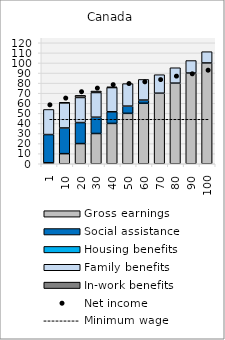
| Category | Gross earnings | Social assistance | Housing benefits | Family benefits | In-work benefits |
|---|---|---|---|---|---|
| 1.0 | 1.001 | 27.956 | 0 | 24.924 | 0 |
| 10.0 | 10 | 25.509 | 0 | 24.924 | 0.425 |
| 20.0 | 20 | 20.85 | 0 | 24.898 | 2.125 |
| 30.0 | 30 | 16.193 | 0 | 24.469 | 1.476 |
| 40.0 | 40 | 11.541 | 0 | 24.042 | 0.673 |
| 50.0 | 50 | 7.174 | 0 | 22.328 | 0 |
| 60.0 | 60 | 3.188 | 0 | 20.463 | 0 |
| 70.0 | 70 | 0 | 0 | 18.352 | 0 |
| 80.0 | 80 | 0 | 0 | 15.251 | 0 |
| 90.0 | 90 | 0 | 0 | 12.385 | 0 |
| 100.0 | 100 | 0 | 0 | 11.186 | 0 |